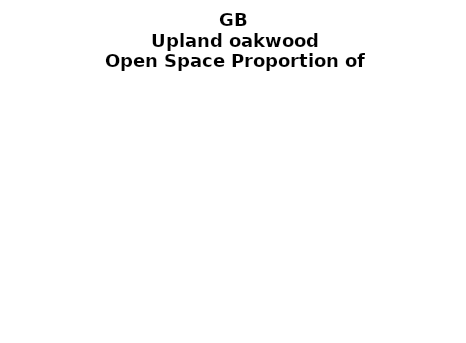
| Category | Upland oakwood |
|---|---|
|  ≥ 10ha, < 10%  | 0.367 |
|   ≥ 10ha, 10-25% | 0.164 |
|   ≥ 10ha, > 25 and <50%  | 0.116 |
|   ≥ 10ha, ≥ 50%  | 0.142 |
|  < 10ha, < 10% | 0.017 |
|  < 10ha, 10-25% | 0.028 |
|  < 10ha, > 25 and < 50% | 0.06 |
|  < 10ha, ≥ 50% | 0.105 |